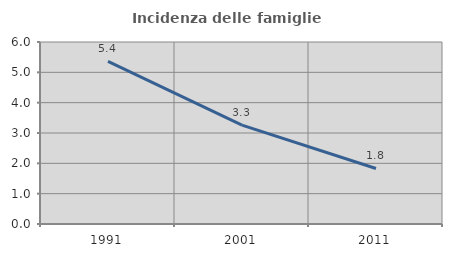
| Category | Incidenza delle famiglie numerose |
|---|---|
| 1991.0 | 5.36 |
| 2001.0 | 3.259 |
| 2011.0 | 1.831 |